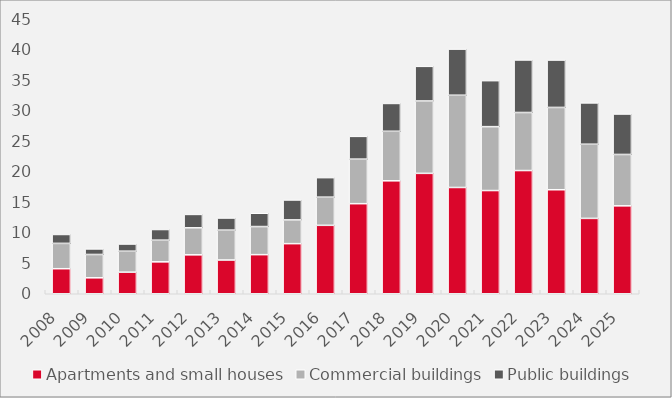
| Category | Apartments and small houses | Commercial buildings | Public buildings |
|---|---|---|---|
| 2008.0 | 4.097 | 4.144 | 1.459 |
| 2009.0 | 2.612 | 3.815 | 0.906 |
| 2010.0 | 3.532 | 3.431 | 1.177 |
| 2011.0 | 5.222 | 3.547 | 1.743 |
| 2012.0 | 6.371 | 4.417 | 2.193 |
| 2013.0 | 5.524 | 4.889 | 1.981 |
| 2014.0 | 6.398 | 4.598 | 2.176 |
| 2015.0 | 8.199 | 3.884 | 3.262 |
| 2016.0 | 11.197 | 4.607 | 3.197 |
| 2017.0 | 14.739 | 7.29 | 3.728 |
| 2018.0 | 18.482 | 8.104 | 4.556 |
| 2019.0 | 19.701 | 11.844 | 5.668 |
| 2020.0 | 17.391 | 15.094 | 7.548 |
| 2021.0 | 16.888 | 10.456 | 7.527 |
| 2022.0 | 20.162 | 9.498 | 8.597 |
| 2023.0 | 17.02 | 13.47 | 7.753 |
| 2024.0 | 12.332 | 12.136 | 6.758 |
| 2025.0 | 14.386 | 8.407 | 6.62 |